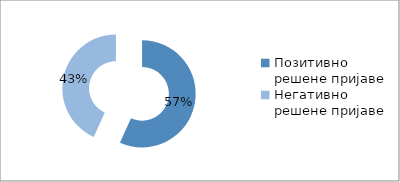
| Category | Series 0 |
|---|---|
| Позитивно решене пријаве | 4662 |
| Негативно решене пријаве | 3547 |